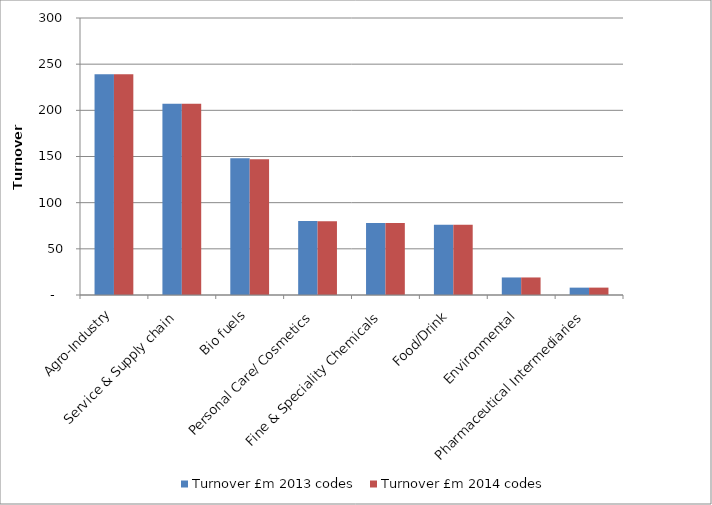
| Category | Turnover £m 2013 codes | Turnover £m 2014 codes |
|---|---|---|
| Agro-Industry | 239 | 239 |
| Service & Supply chain | 207 | 207 |
| Bio fuels | 148 | 147 |
| Personal Care/ Cosmetics | 80.139 | 80 |
| Fine & Speciality Chemicals | 78 | 78 |
| Food/Drink | 76 | 76 |
| Environmental | 19 | 19 |
| Pharmaceutical Intermediaries | 7.97 | 8 |